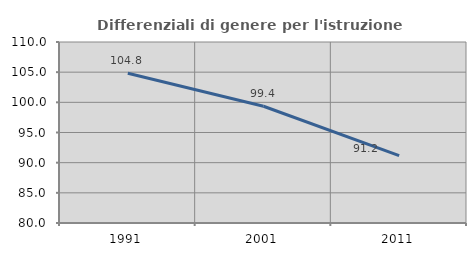
| Category | Differenziali di genere per l'istruzione superiore |
|---|---|
| 1991.0 | 104.808 |
| 2001.0 | 99.35 |
| 2011.0 | 91.161 |